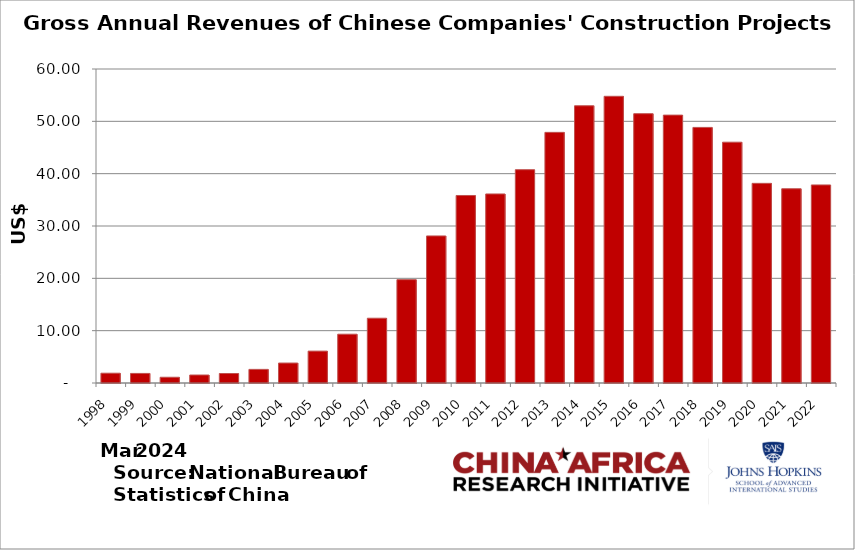
| Category | Series 1 |
|---|---|
| 1998.0 | 1.871 |
| 1999.0 | 1.828 |
| 2000.0 | 1.096 |
| 2001.0 | 1.524 |
| 2002.0 | 1.814 |
| 2003.0 | 2.601 |
| 2004.0 | 3.813 |
| 2005.0 | 6.092 |
| 2006.0 | 9.324 |
| 2007.0 | 12.376 |
| 2008.0 | 19.749 |
| 2009.0 | 28.099 |
| 2010.0 | 35.83 |
| 2011.0 | 36.122 |
| 2012.0 | 40.758 |
| 2013.0 | 47.891 |
| 2014.0 | 52.974 |
| 2015.0 | 54.784 |
| 2016.0 | 51.46 |
| 2017.0 | 51.188 |
| 2018.0 | 48.839 |
| 2019.0 | 46.013 |
| 2020.0 | 38.149 |
| 2021.0 | 37.116 |
| 2022.0 | 37.844 |